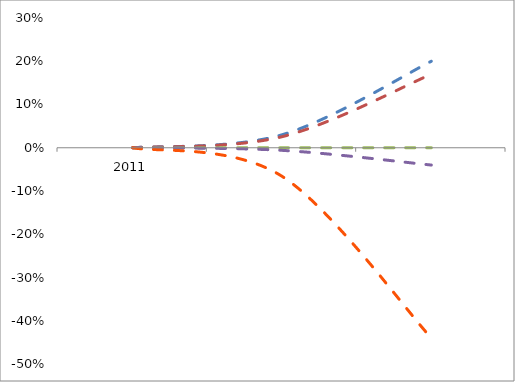
| Category | Series 0 | Series 1 | Series 2 | Series 3 | Series 4 |
|---|---|---|---|---|---|
| 0 | 0 | 0 | 0 | 0 | 0 |
| 1 | 0.03 | 0.025 | 0 | -0.006 | -0.066 |
| 2 | 0.2 | 0.17 | 0 | -0.04 | -0.44 |